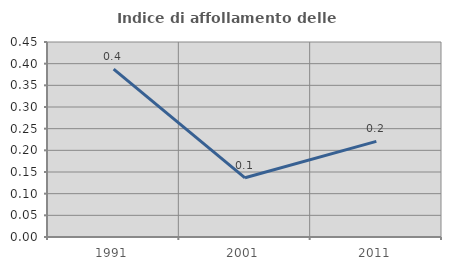
| Category | Indice di affollamento delle abitazioni  |
|---|---|
| 1991.0 | 0.387 |
| 2001.0 | 0.137 |
| 2011.0 | 0.221 |